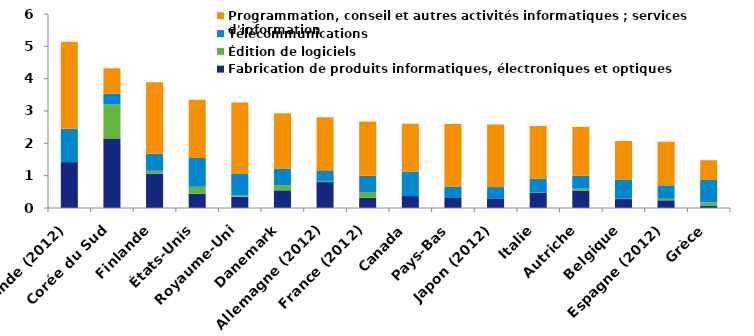
| Category | Fabrication de produits informatiques, électroniques et optiques | Édition de logiciels | Télécommunications | Programmation, conseil et autres activités informatiques ; services d'information |
|---|---|---|---|---|
| Irlande (2012) | 1.42 | 0 | 1.028 | 2.692 |
| Corée du Sud | 2.147 | 1.052 | 0.333 | 0.79 |
| Finlande | 1.064 | 0.086 | 0.524 | 2.216 |
| États-Unis | 0.438 | 0.219 | 0.889 | 1.802 |
| Royaume-Uni | 0.35 | 0.036 | 0.664 | 2.216 |
| Danemark | 0.546 | 0.162 | 0.509 | 1.71 |
| Allemagne (2012) | 0.802 | 0.037 | 0.307 | 1.658 |
| France (2012) | 0.321 | 0.173 | 0.502 | 1.68 |
| Canada | 0.369 | 0 | 0.758 | 1.481 |
| Pays-Bas | 0.31 | 0 | 0.356 | 1.931 |
| Japon (2012) | 0.3 | 0 | 0.347 | 1.939 |
| Italie | 0.481 | 0.015 | 0.411 | 1.627 |
| Autriche | 0.54 | 0.059 | 0.402 | 1.509 |
| Belgique | 0.277 | 0.009 | 0.583 | 1.206 |
| Espagne (2012) | 0.238 | 0.047 | 0.417 | 1.35 |
| Grèce | 0.076 | 0.097 | 0.697 | 0.607 |